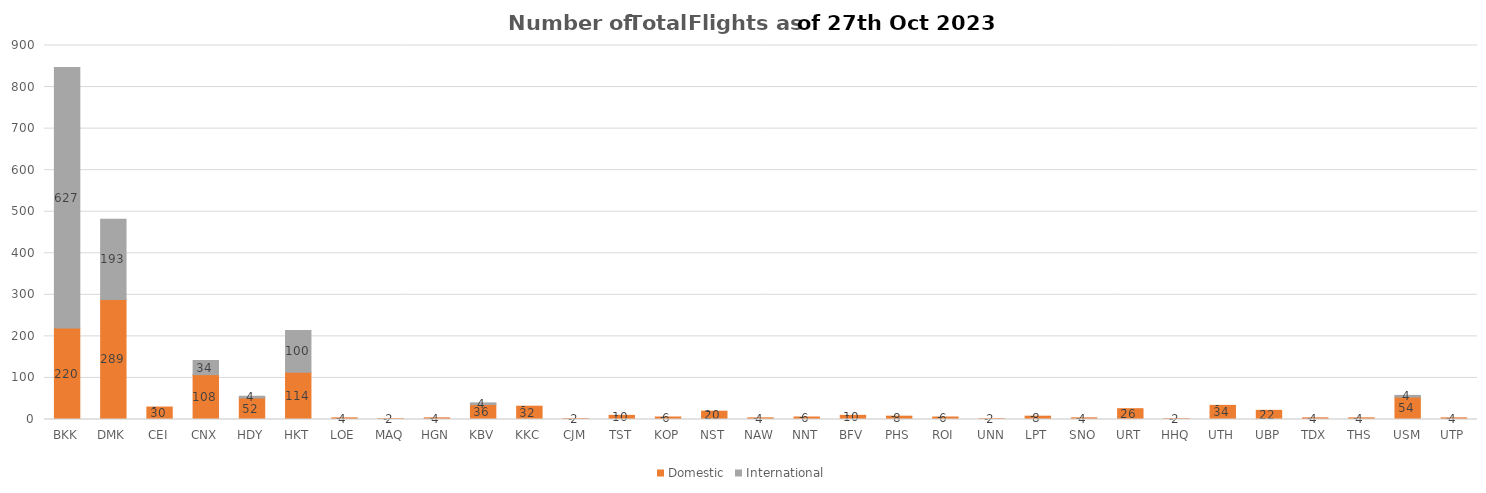
| Category | Domestic | International |
|---|---|---|
| BKK | 220 | 627 |
| DMK | 289 | 193 |
| CEI | 30 | 0 |
| CNX | 108 | 34 |
| HDY | 52 | 4 |
| HKT | 114 | 100 |
| LOE | 4 | 0 |
| MAQ | 2 | 0 |
| HGN | 4 | 0 |
| KBV | 36 | 4 |
| KKC | 32 | 0 |
| CJM | 2 | 0 |
| TST | 10 | 0 |
| KOP | 6 | 0 |
| NST | 20 | 0 |
| NAW | 4 | 0 |
| NNT | 6 | 0 |
| BFV | 10 | 0 |
| PHS | 8 | 0 |
| ROI | 6 | 0 |
| UNN | 2 | 0 |
| LPT | 8 | 0 |
| SNO | 4 | 0 |
| URT | 26 | 0 |
| HHQ | 2 | 0 |
| UTH | 34 | 0 |
| UBP | 22 | 0 |
| TDX | 4 | 0 |
| THS | 4 | 0 |
| USM | 54 | 4 |
| UTP | 4 | 0 |